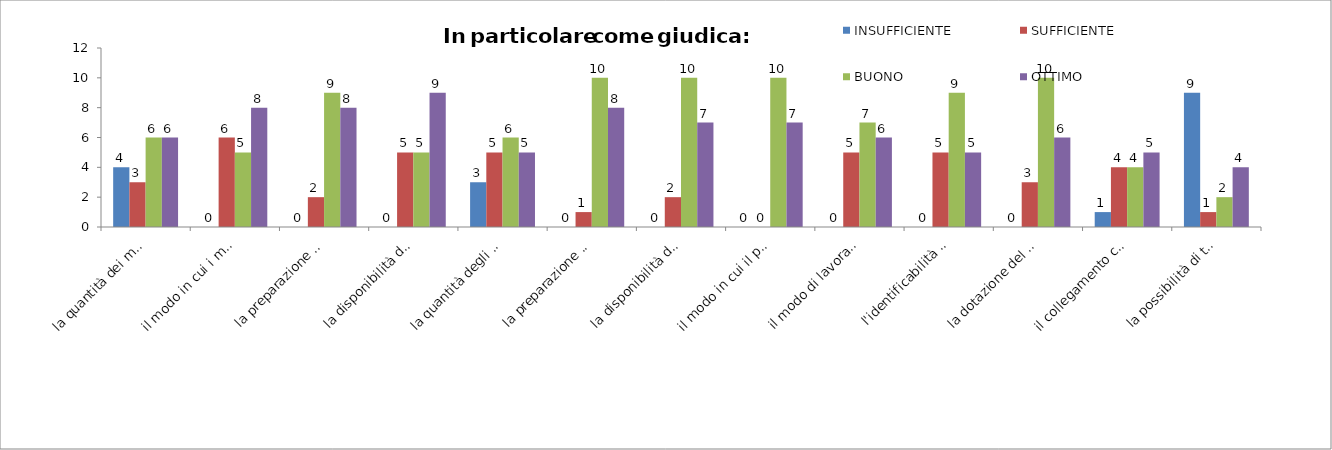
| Category | INSUFFICIENTE | SUFFICIENTE | BUONO | OTTIMO |
|---|---|---|---|---|
| la quantità dei medici presenti | 4 | 3 | 6 | 6 |
| il modo in cui i medici trattano i degenti | 0 | 6 | 5 | 8 |
|  la preparazione dei medici | 0 | 2 | 9 | 8 |
|  la disponibilità dei medici verso i degenti | 0 | 5 | 5 | 9 |
| la quantità degli infermieri presenti | 3 | 5 | 6 | 5 |
| la preparazione degli infermieri | 0 | 1 | 10 | 8 |
|  la disponibilità degli infermieri ad assistere i degenti | 0 | 2 | 10 | 7 |
| il modo in cui il personale ausiliario tratta i degenti | 0 | 0 | 10 | 7 |
| il modo di lavorare degli ausiliari (addetti alle pulizie, ecc) | 0 | 5 | 7 | 6 |
|  l'identificabilità del personale medico, infermieristico, ecc | 0 | 5 | 9 | 5 |
| la dotazione del materiale sanitario | 0 | 3 | 10 | 6 |
| il collegamento con la rete dei trasporti pubblici | 1 | 4 | 4 | 5 |
|  la possibilità di trovare parcheggio | 9 | 1 | 2 | 4 |